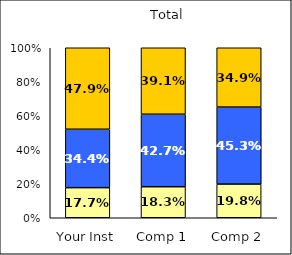
| Category | Low Civic Engagement | Average Civic Engagement | High Civic Engagement |
|---|---|---|---|
| Your Inst | 0.177 | 0.344 | 0.479 |
| Comp 1 | 0.182 | 0.427 | 0.391 |
| Comp 2 | 0.198 | 0.453 | 0.349 |